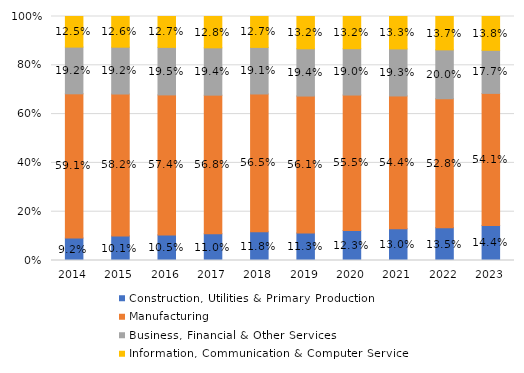
| Category | Construction, Utilities & Primary Production  | Manufacturing  | Business, Financial & Other Services | Information, Communication & Computer Services |
|---|---|---|---|---|
| 2014 | 0.092 | 0.591 | 0.192 | 0.125 |
| 2015 | 0.101 | 0.582 | 0.192 | 0.126 |
| 2016 | 0.105 | 0.574 | 0.195 | 0.127 |
| 2017 | 0.11 | 0.568 | 0.194 | 0.128 |
| 2018 | 0.118 | 0.565 | 0.191 | 0.127 |
| 2019 | 0.113 | 0.561 | 0.194 | 0.132 |
| 2020 | 0.123 | 0.555 | 0.19 | 0.132 |
| 2021 | 0.13 | 0.544 | 0.193 | 0.133 |
| 2022 | 0.135 | 0.528 | 0.2 | 0.137 |
| 2023 | 0.144 | 0.541 | 0.177 | 0.138 |